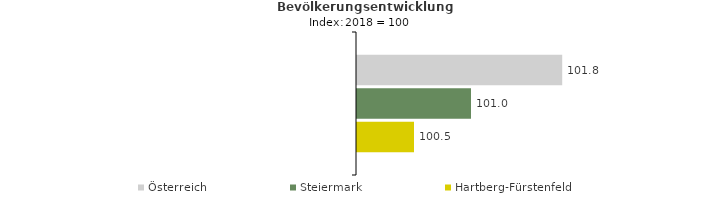
| Category | Österreich | Steiermark | Hartberg-Fürstenfeld |
|---|---|---|---|
| 2022.0 | 101.8 | 101 | 100.5 |